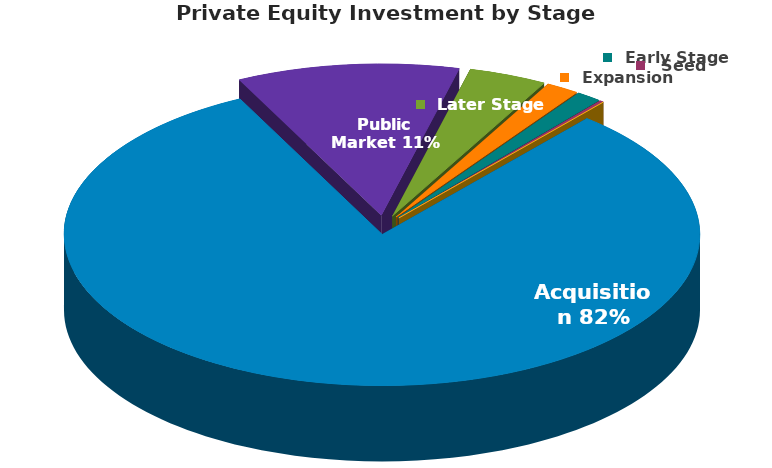
| Category | Series 0 |
|---|---|
| Acquisition | 1344.361 |
| Public Market | 186.58 |
| Later Stage | 65.591 |
| Expansion | 27.785 |
| Early Stage | 21.136 |
| Seed | 3.72 |
| Other | 0 |